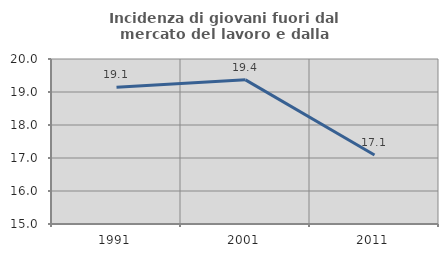
| Category | Incidenza di giovani fuori dal mercato del lavoro e dalla formazione  |
|---|---|
| 1991.0 | 19.143 |
| 2001.0 | 19.368 |
| 2011.0 | 17.093 |